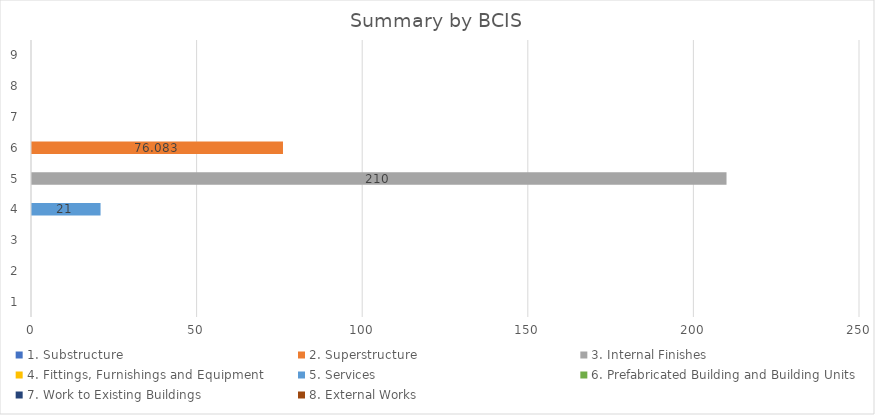
| Category | 1. Substructure | 2. Superstructure | 3. Internal Finishes | 4. Fittings, Furnishings and Equipment | 5. Services | 6. Prefabricated Building and Building Units | 7. Work to Existing Buildings | 8. External Works |
|---|---|---|---|---|---|---|---|---|
| 0 | 0 | 0 | 0 | 0 | 0 | 0 | 0 | 0 |
| 1 | 0 | 0 | 0 | 0 | 0 | 0 | 0 | 0 |
| 2 | 0 | 0 | 0 | 0 | 0 | 0 | 0 | 0 |
| 3 | 0 | 0 | 0 | 0 | 21 | 0 | 0 | 0 |
| 4 | 0 | 0 | 210 | 0 | 0 | 0 | 0 | 0 |
| 5 | 0 | 76.083 | 0 | 0 | 0 | 0 | 0 | 0 |
| 6 | 0 | 0 | 0 | 0 | 0 | 0 | 0 | 0 |
| 7 | 0 | 0 | 0 | 0 | 0 | 0 | 0 | 0 |
| 8 | 0 | 0 | 0 | 0 | 0 | 0 | 0 | 0 |